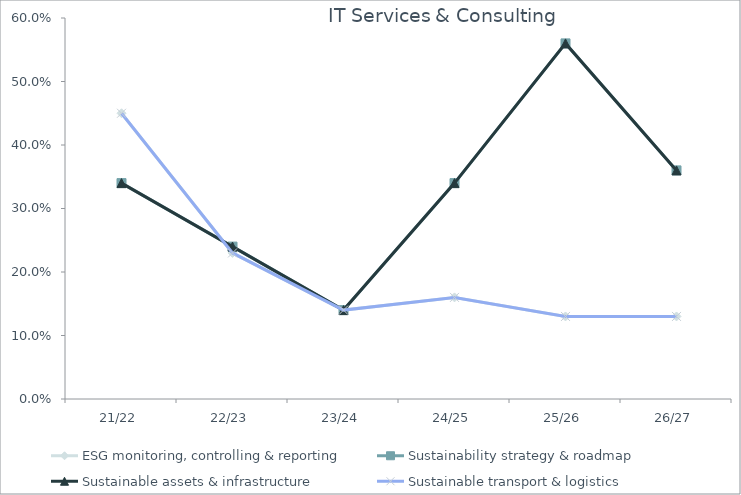
| Category | ESG monitoring, controlling & reporting | Sustainability strategy & roadmap | Sustainable assets & infrastructure | Sustainable transport & logistics |
|---|---|---|---|---|
| 21/22 | 0.45 | 0.34 | 0.34 | 0.45 |
| 22/23 | 0.23 | 0.24 | 0.24 | 0.23 |
| 23/24 | 0.14 | 0.14 | 0.14 | 0.14 |
| 24/25 | 0.16 | 0.34 | 0.34 | 0.16 |
| 25/26 | 0.13 | 0.56 | 0.56 | 0.13 |
| 26/27 | 0.13 | 0.36 | 0.36 | 0.13 |